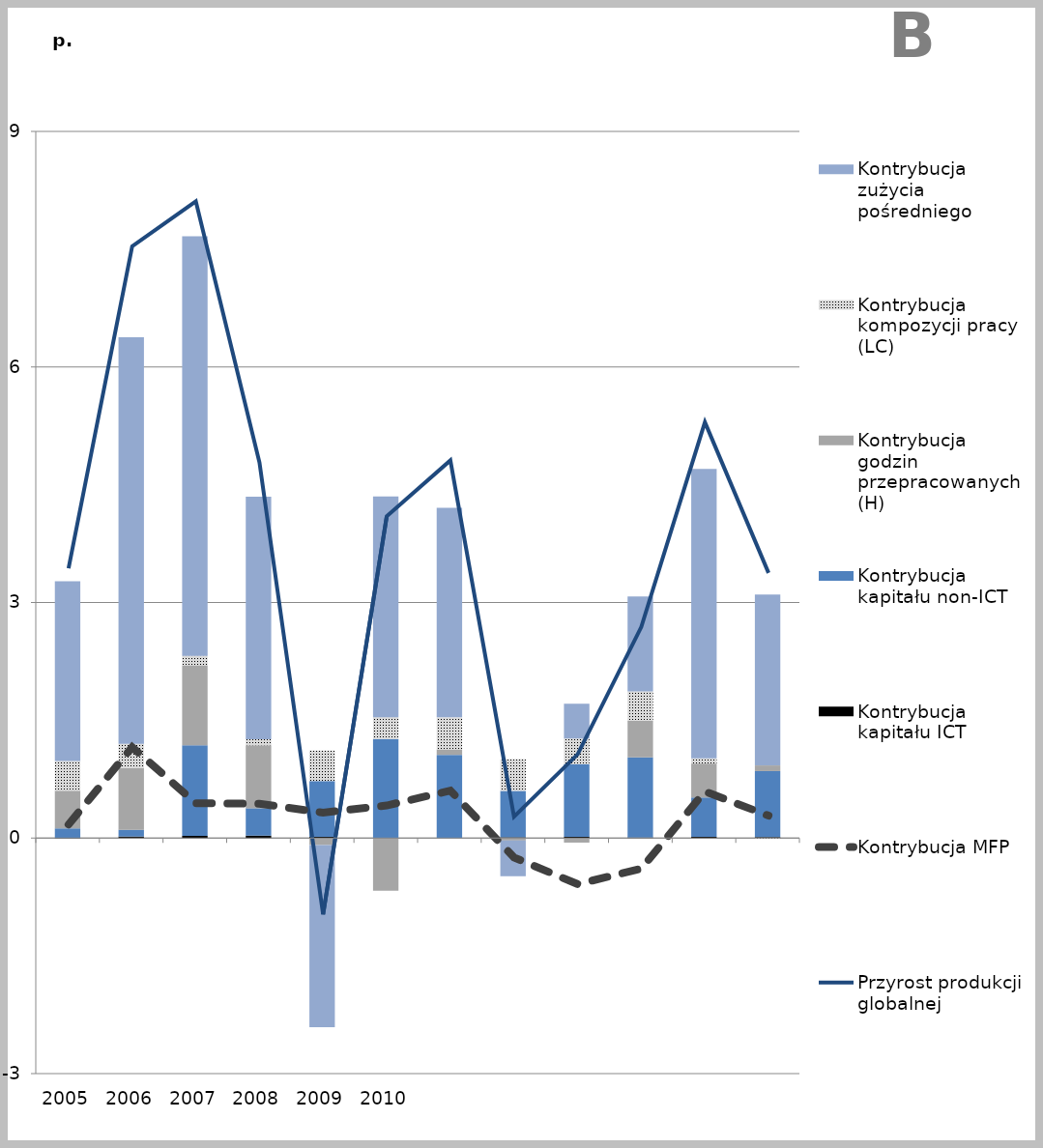
| Category | Kontrybucja kapitału ICT | Kontrybucja kapitału non-ICT | Kontrybucja godzin przepracowanych (H) | Kontrybucja kompozycji pracy (LC) | Kontrybucja zużycia pośredniego |
|---|---|---|---|---|---|
| 2005.0 | -0.008 | 0.123 | 0.479 | 0.379 | 2.289 |
| 2006.0 | 0.019 | 0.086 | 0.788 | 0.307 | 5.178 |
| 2007.0 | 0.028 | 1.153 | 1.019 | 0.12 | 5.346 |
| 2008.0 | 0.031 | 0.349 | 0.802 | 0.076 | 3.089 |
| 2009.0 | 0.016 | 0.71 | -0.089 | 0.389 | -2.321 |
| 2010.0 | -0.003 | 1.262 | -0.667 | 0.278 | 2.811 |